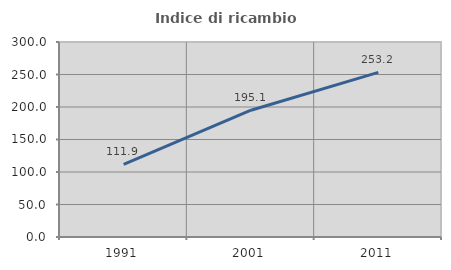
| Category | Indice di ricambio occupazionale  |
|---|---|
| 1991.0 | 111.89 |
| 2001.0 | 195.062 |
| 2011.0 | 253.209 |